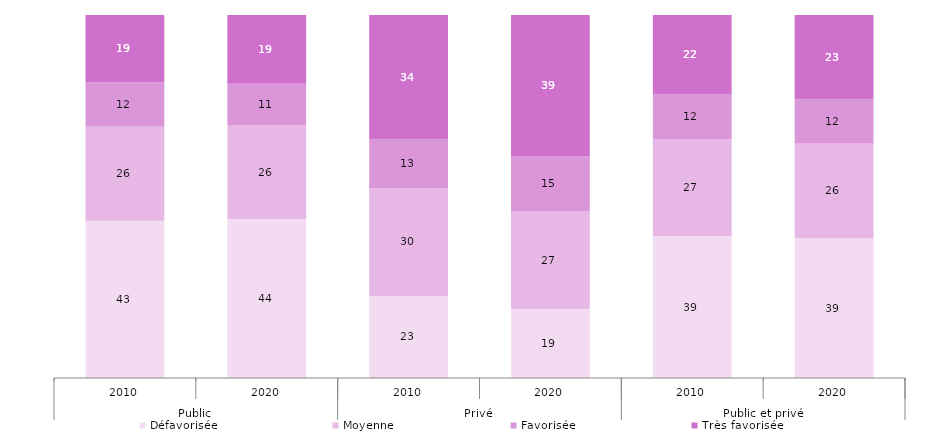
| Category | Défavorisée | Moyenne | Favorisée | Très favorisée |
|---|---|---|---|---|
| 0 | 43.29 | 25.99 | 12.13 | 18.58 |
| 1 | 43.769 | 25.835 | 11.426 | 18.97 |
| 2 | 22.61 | 29.76 | 13.43 | 34.2 |
| 3 | 18.991 | 26.939 | 15.084 | 38.986 |
| 4 | 39.02 | 26.77 | 12.4 | 21.81 |
| 5 | 38.523 | 26.069 | 12.201 | 23.208 |